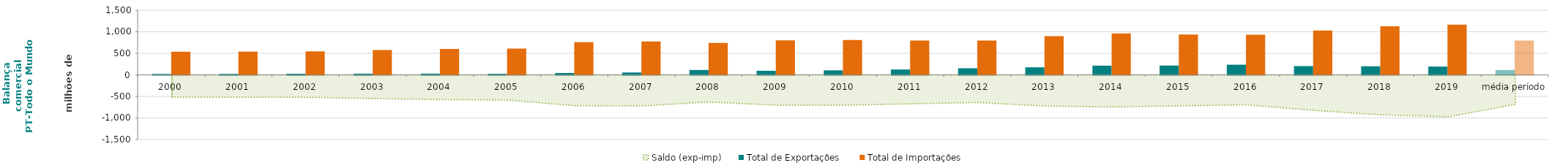
| Category | Total de Exportações  | Total de Importações  |
|---|---|---|
| 2000 | 21.045 | 536.924 |
| 2001 | 21.969 | 539.787 |
| 2002 | 25.673 | 545.406 |
| 2003 | 26.816 | 576.948 |
| 2004 | 28.473 | 601.468 |
| 2005 | 24.529 | 609.431 |
| 2006 | 43.235 | 758.088 |
| 2007 | 55.868 | 774.848 |
| 2008 | 113.493 | 743.048 |
| 2009 | 94.986 | 798.961 |
| 2010 | 104.812 | 808.095 |
| 2011 | 124.655 | 796.897 |
| 2012 | 153.084 | 794.759 |
| 2013 | 174.954 | 898.104 |
| 2014 | 213.66 | 959.857 |
| 2015 | 216.25 | 934.523 |
| 2016 | 235.586 | 931.359 |
| 2017 | 203.466 | 1027.78 |
| 2018 | 199.095 | 1125.824 |
| 2019 | 192.483 | 1165.965 |
| média período | 113.707 | 796.404 |